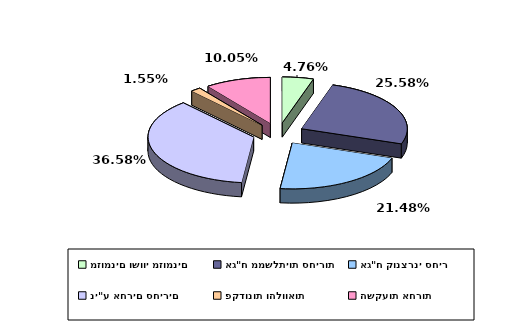
| Category | Series 0 |
|---|---|
| מזומנים ושווי מזומנים | 0.048 |
| אג"ח ממשלתיות סחירות | 0.256 |
| אג"ח קונצרני סחיר | 0.215 |
| ני"ע אחרים סחירים | 0.366 |
| פקדונות והלוואות | 0.015 |
| השקעות אחרות | 0.1 |